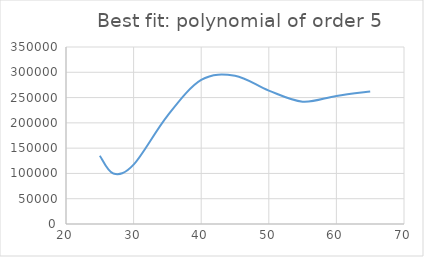
| Category | Series 0 |
|---|---|
| 25.0 | 134965.392 |
| 27.0 | 99724.961 |
| 30.0 | 117292.624 |
| 35.0 | 213895.803 |
| 40.0 | 284897.914 |
| 45.0 | 293253.806 |
| 50.0 | 263742.044 |
| 55.0 | 241956.764 |
| 60.0 | 253299.527 |
| 65.0 | 261971.166 |